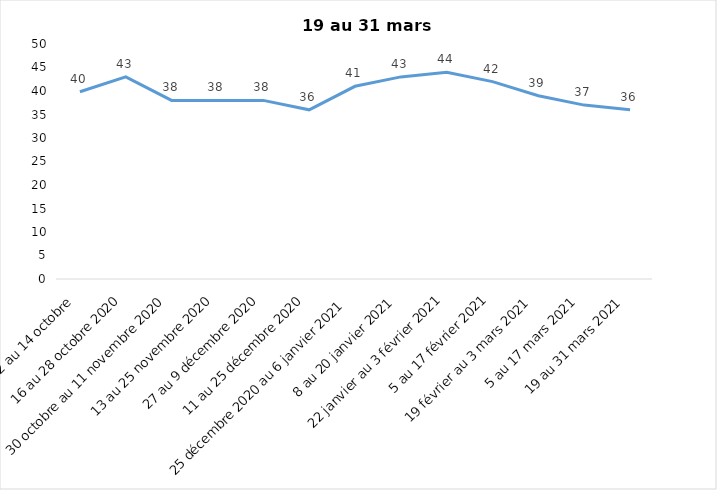
| Category | Toujours aux trois mesures |
|---|---|
| 2 au 14 octobre  | 39.85 |
| 16 au 28 octobre 2020 | 43 |
| 30 octobre au 11 novembre 2020 | 38 |
| 13 au 25 novembre 2020 | 38 |
| 27 au 9 décembre 2020 | 38 |
| 11 au 25 décembre 2020 | 36 |
| 25 décembre 2020 au 6 janvier 2021 | 41 |
| 8 au 20 janvier 2021 | 43 |
| 22 janvier au 3 février 2021 | 44 |
| 5 au 17 février 2021 | 42 |
| 19 février au 3 mars 2021 | 39 |
| 5 au 17 mars 2021 | 37 |
| 19 au 31 mars 2021 | 36 |